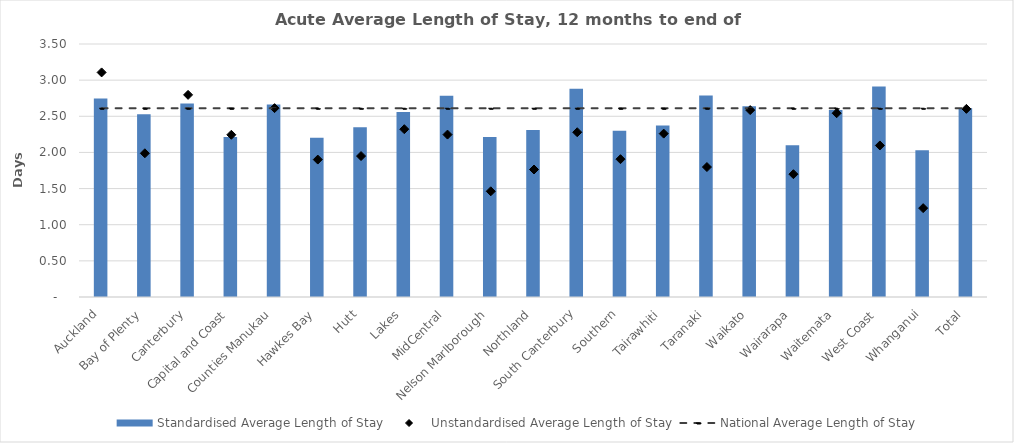
| Category | Standardised Average Length of Stay |
|---|---|
| Auckland | 2.745 |
| Bay of Plenty | 2.53 |
| Canterbury | 2.675 |
| Capital and Coast | 2.214 |
| Counties Manukau | 2.662 |
| Hawkes Bay | 2.202 |
| Hutt | 2.35 |
| Lakes | 2.559 |
| MidCentral | 2.784 |
| Nelson Marlborough | 2.214 |
| Northland | 2.31 |
| South Canterbury | 2.88 |
| Southern | 2.301 |
| Tairawhiti | 2.372 |
| Taranaki | 2.789 |
| Waikato | 2.637 |
| Wairarapa | 2.1 |
| Waitemata | 2.588 |
| West Coast | 2.91 |
| Whanganui | 2.029 |
| Total | 2.611 |